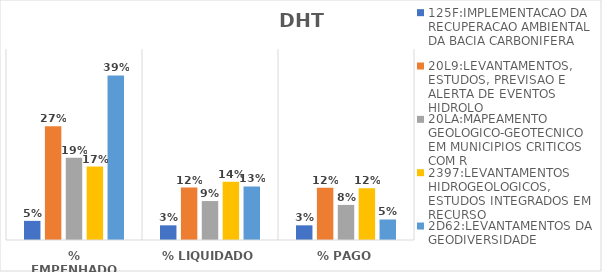
| Category | 125F:IMPLEMENTACAO DA RECUPERACAO AMBIENTAL DA BACIA CARBONIFERA | 20L9:LEVANTAMENTOS, ESTUDOS, PREVISAO E ALERTA DE EVENTOS HIDROLO | 20LA:MAPEAMENTO GEOLOGICO-GEOTECNICO EM MUNICIPIOS CRITICOS COM R | 2397:LEVANTAMENTOS HIDROGEOLOGICOS, ESTUDOS INTEGRADOS EM RECURSO | 2D62:LEVANTAMENTOS DA GEODIVERSIDADE |
|---|---|---|---|---|---|
| % EMPENHADO | 0.045 | 0.268 | 0.194 | 0.173 | 0.388 |
| % LIQUIDADO | 0.035 | 0.124 | 0.092 | 0.137 | 0.126 |
| % PAGO | 0.035 | 0.123 | 0.083 | 0.122 | 0.048 |